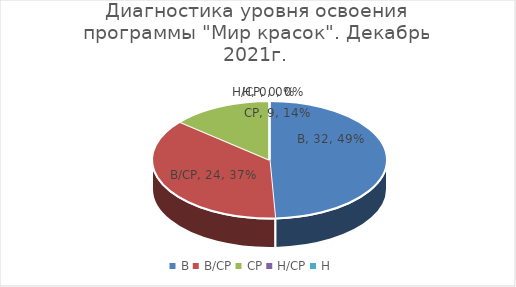
| Category | Декабрь 2021 |
|---|---|
| В | 32 |
| В/СР | 24 |
| СР | 9 |
| Н/СР | 0 |
| Н | 0 |